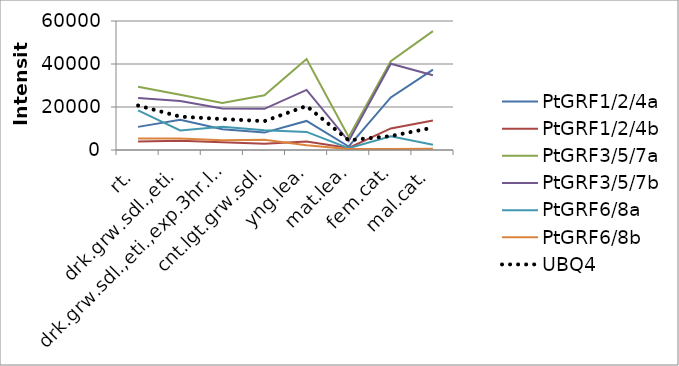
| Category | PtGRF1/2/4a | PtGRF1/2/4b | PtGRF3/5/7a | PtGRF3/5/7b | PtGRF6/8a | PtGRF6/8b | UBQ4 |
|---|---|---|---|---|---|---|---|
| rt. | 10755.93 | 3896.53 | 29421.4 | 24239.43 | 18403.36 | 5351.1 | 20687.1 |
| drk.grw.sdl.,eti. | 14070.75 | 4356.54 | 25742.65 | 22763.2 | 9087.1 | 5375.95 | 15525.7 |
| drk.grw.sdl.,eti.,exp.3hr.lgt. | 9661.65 | 3601.55 | 21909.1 | 19260.3 | 10832.25 | 4570 | 14387.65 |
| cnt.lgt.grw.sdl. | 8096.2 | 2879.53 | 25453.5 | 19144.86 | 9167.56 | 4715.09 | 13427.06 |
| yng.lea. | 13527.16 | 3905.83 | 42335.7 | 27944.13 | 8410.69 | 2222.5 | 20471.63 |
| mat.lea. | 1628.54 | 922.04 | 6052.55 | 4146.24 | 838.25 | 415.37 | 4512.3 |
| fem.cat. | 24454.13 | 10014.96 | 41316.29 | 40145.63 | 6429.4 | 477.5 | 6494.56 |
| mal.cat. | 37402.63 | 13719.33 | 55293.46 | 34738.03 | 2396.46 | 539.33 | 10425.36 |